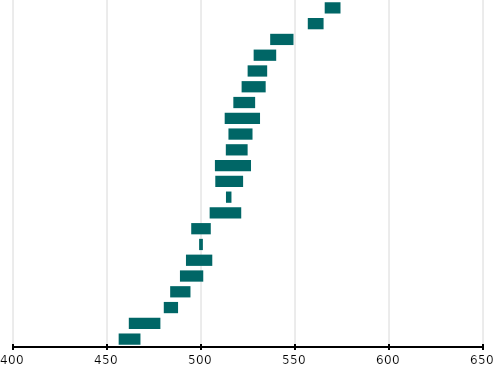
| Category | Series 0 | Series 1 |
|---|---|---|
| Japon | 565.8 | 8.4 |
| Corée | 556.8 | 8.4 |
| Finlande | 536.8 | 12.4 |
| Lituanie | 528 | 12 |
| Hongrie | 524.8 | 10.4 |
| Australie | 521.6 | 12.8 |
| Irlande | 517.2 | 11.6 |
| États-Unis | 512.6 | 18.8 |
| Suède | 514.6 | 12.8 |
| Portugal | 513.2 | 11.6 |
| Angleterre | 507.4 | 19.2 |
| Turquie | 507.6 | 14.8 |
| Moyenne Internationale (UE et/ou OCDE) | 513.278 | 2.923 |
| Israël | 504.6 | 16.8 |
| Italie | 494.8 | 10.4 |
| Centre de l'échelle TIMSS | 499 | 2 |
| Nouvelle-Zélande | 492 | 14 |
| Norvège* | 488.8 | 12.4 |
| France | 483.6 | 10.8 |
| Chypre | 480.2 | 7.6 |
| Roumanie | 461.6 | 16.8 |
| Chili | 456.2 | 11.6 |